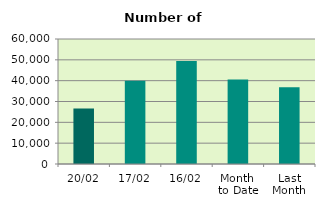
| Category | Series 0 |
|---|---|
| 20/02 | 26622 |
| 17/02 | 40010 |
| 16/02 | 49470 |
| Month 
to Date | 40527.143 |
| Last
Month | 36886.364 |